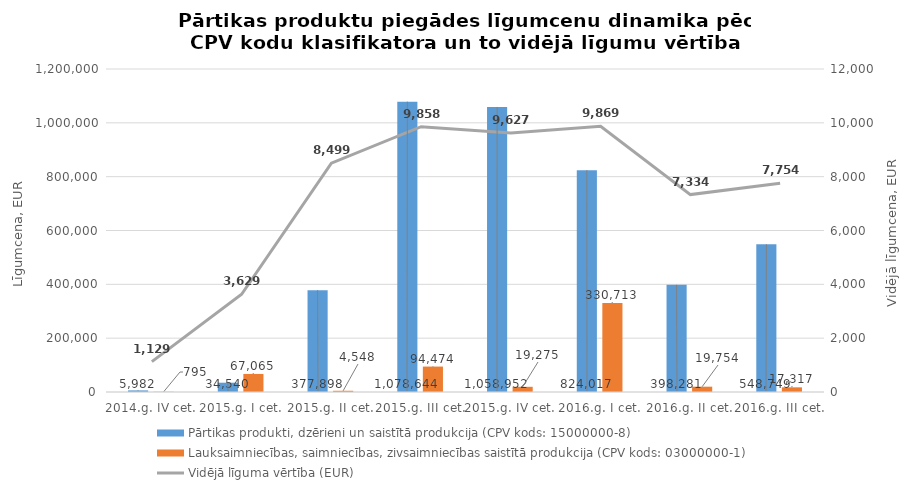
| Category | Pārtikas produkti, dzērieni un saistītā produkcija (CPV kods: 15000000-8) | Lauksaimniecības, saimniecības, zivsaimniecības saistītā produkcija (CPV kods: 03000000-1) |
|---|---|---|
| 2014.g. IV cet. | 5982 | 795 |
| 2015.g. I cet. | 34540 | 67065 |
| 2015.g. II cet. | 377898 | 4548 |
| 2015.g. III cet. | 1078644 | 94474 |
| 2015.g. IV cet. | 1058952 | 19275 |
| 2016.g. I cet. | 824017 | 330713 |
| 2016.g. II cet. | 398281 | 19754 |
| 2016.g. III cet. | 548749.01 | 17317 |